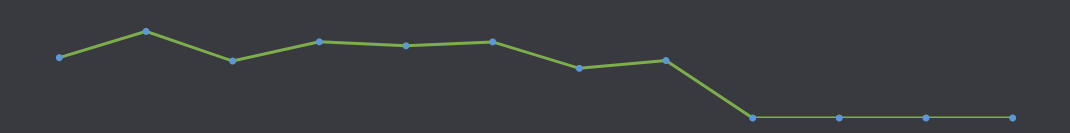
| Category | Saadaval raha |
|---|---|
| JAAN | 820 |
| VEEBR | 1177 |
| MÄRTS | 774 |
| APR | 1035 |
| MAI | 981 |
| JUUNI | 1034 |
| JUULI | 675 |
| AUG | 781 |
| SEPT | 0 |
| OKT | 0 |
| NOV | 0 |
| DETS | 0 |